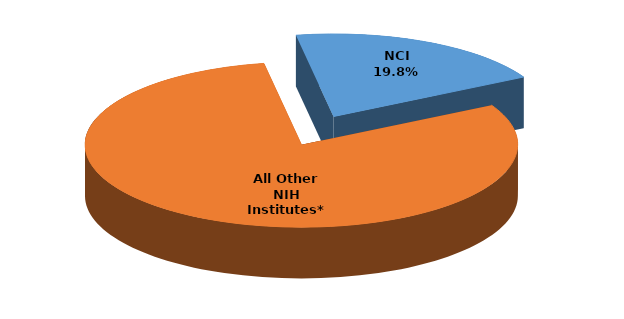
| Category | Series 0 |
|---|---|
| NCI | 464970197.08 |
| All Other NIH Institutes* | 1879532736.06 |